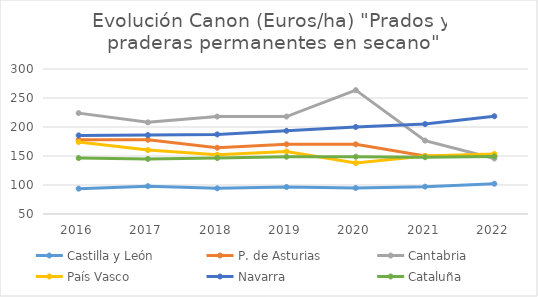
| Category | Castilla y León | P. de Asturias | Cantabria | País Vasco | Navarra | Cataluña |
|---|---|---|---|---|---|---|
| 2016.0 | 93.721 | 178 | 223.93 | 174.066 | 185.5 | 146.457 |
| 2017.0 | 98.003 | 178 | 208 | 160.291 | 186 | 145.027 |
| 2018.0 | 94.274 | 164.28 | 218 | 152.125 | 187.18 | 146.596 |
| 2019.0 | 96.485 | 170.14 | 218 | 157.841 | 193.5 | 148.753 |
| 2020.0 | 94.878 | 170.15 | 263.52 | 137.778 | 200.08 | 148.801 |
| 2021.0 | 97.142 | 150 | 176.5 | 150.162 | 205.08 | 147.94 |
| 2022.0 | 102.177 | 150 | 145.75 | 153.494 | 218.5 | 149.135 |